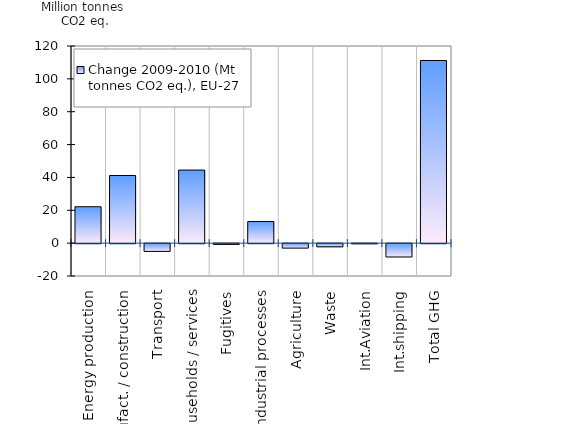
| Category | Change 2009-2010 (Mt tonnes CO2 eq.), EU-27 |
|---|---|
| Energy production | 22.177 |
| Manufact. / construction | 41.183 |
| Transport | -4.732 |
| Households / services | 44.486 |
| Fugitives | -0.468 |
| Industrial processes | 13.166 |
| Agriculture | -2.721 |
| Waste | -1.911 |
| Int.Aviation | -0.104 |
| Int.shipping | -8.13 |
| Total GHG | 111.179 |